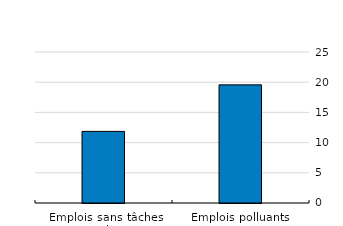
| Category | Wage_p |
|---|---|
| Emplois sans tâches vertes | 11.854 |
| Emplois polluants | 19.558 |